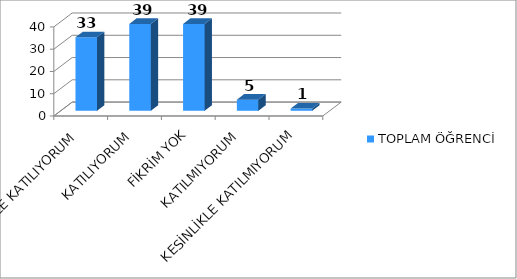
| Category | TOPLAM ÖĞRENCİ |
|---|---|
| KESİNLİKLE KATILIYORUM | 33 |
| KATILIYORUM | 39 |
| FİKRİM YOK | 39 |
| KATILMIYORUM | 5 |
| KESİNLİKLE KATILMIYORUM | 1 |